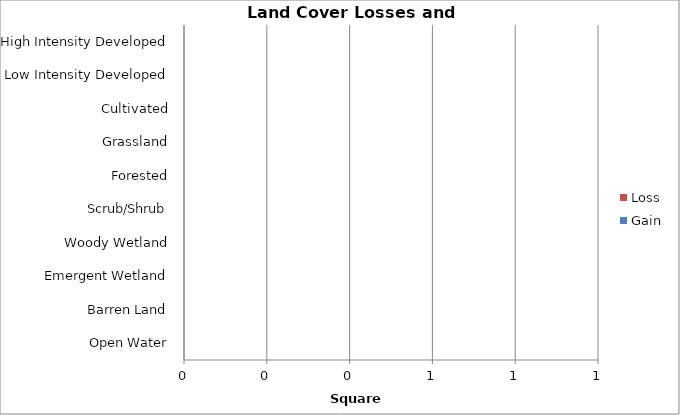
| Category | Loss | Gain |
|---|---|---|
| High Intensity Developed | 0 | 0 |
| Low Intensity Developed | 0 | 0 |
| Cultivated | 0 | 0 |
| Grassland | 0 | 0 |
| Forested | 0 | 0 |
| Scrub/Shrub | 0 | 0 |
| Woody Wetland | 0 | 0 |
| Emergent Wetland | 0 | 0 |
| Barren Land | 0 | 0 |
| Open Water | 0 | 0 |